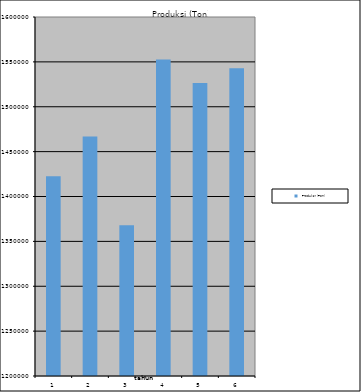
| Category | Produksi (Ton) |
|---|---|
| 0 | 1422441 |
| 1 | 1466757 |
| 2 | 1367869 |
| 3 | 1552628 |
| 4 | 1526347 |
| 5 | 1542788 |